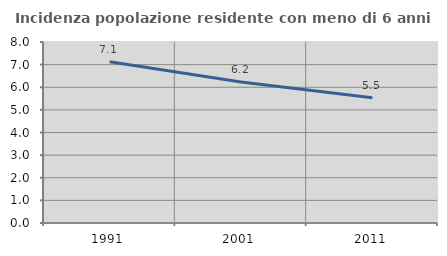
| Category | Incidenza popolazione residente con meno di 6 anni |
|---|---|
| 1991.0 | 7.129 |
| 2001.0 | 6.228 |
| 2011.0 | 5.534 |